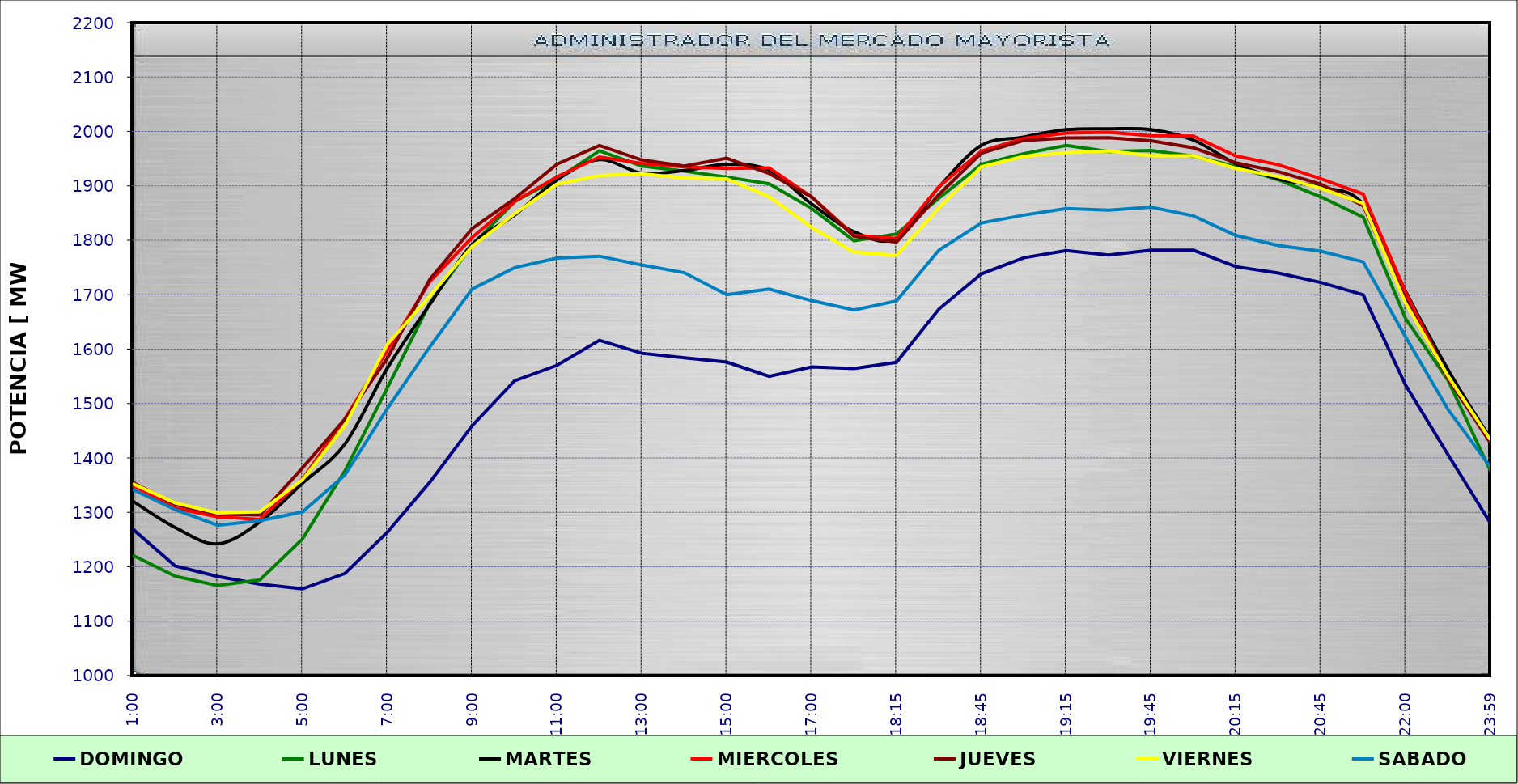
| Category | DOMINGO | LUNES | MARTES | MIERCOLES | JUEVES | VIERNES | SABADO |
|---|---|---|---|---|---|---|---|
| 0.041666666666666664 | 1269.32 | 1221.15 | 1320.69 | 1349.3 | 1354.98 | 1352.63 | 1342.05 |
| 0.0833333333333333 | 1201.42 | 1182.73 | 1272.12 | 1307.76 | 1314.38 | 1317.47 | 1304.84 |
| 0.125 | 1182.18 | 1165.47 | 1242.08 | 1291.84 | 1296.75 | 1298.78 | 1276.22 |
| 0.166666666666667 | 1167.98 | 1176 | 1282.62 | 1286.93 | 1295.22 | 1301.22 | 1284.7 |
| 0.208333333333333 | 1159.47 | 1251.11 | 1353.43 | 1361.15 | 1381.51 | 1359.65 | 1300.68 |
| 0.25 | 1187.6 | 1376.09 | 1425.53 | 1472.02 | 1471.34 | 1459.37 | 1368.42 |
| 0.291666666666667 | 1263.23 | 1528.44 | 1564.84 | 1597.07 | 1582.9 | 1608.51 | 1490.37 |
| 0.333333333333333 | 1355.18 | 1684.25 | 1681.92 | 1723.81 | 1728.24 | 1697.27 | 1603.75 |
| 0.375 | 1459.23 | 1791.16 | 1792.45 | 1805.2 | 1821.47 | 1788.9 | 1710.58 |
| 0.416666666666667 | 1541.74 | 1870.95 | 1846.07 | 1871.19 | 1876.46 | 1848.41 | 1749.61 |
| 0.458333333333333 | 1570.24 | 1912.86 | 1911.14 | 1916.82 | 1939.78 | 1903.26 | 1767.37 |
| 0.5 | 1616.25 | 1964.4 | 1948.23 | 1953.12 | 1974.18 | 1919.02 | 1770.78 |
| 0.541666666666667 | 1592.38 | 1936.37 | 1923.22 | 1941.32 | 1947.54 | 1922.29 | 1754.51 |
| 0.583333333333333 | 1584.15 | 1927.25 | 1928.24 | 1935.06 | 1936.43 | 1914.34 | 1740.46 |
| 0.625 | 1576.19 | 1916.18 | 1939.3 | 1932.13 | 1950.7 | 1913.01 | 1699.99 |
| 0.666666666666667 | 1550.01 | 1903.7 | 1928.78 | 1933.22 | 1922.72 | 1879.8 | 1710.28 |
| 0.708333333333333 | 1567.39 | 1858.54 | 1866.91 | 1879.93 | 1879.72 | 1823.8 | 1689.12 |
| 0.75 | 1564.39 | 1798.99 | 1815.7 | 1809.32 | 1807.13 | 1777.98 | 1671.9 |
| 0.7604166666666666 | 1575.74 | 1811.64 | 1803.54 | 1803.41 | 1796.32 | 1772.38 | 1688.61 |
| 0.7708333333333334 | 1673.51 | 1877.26 | 1897.59 | 1898.59 | 1884.03 | 1859.83 | 1781.81 |
| 0.78125 | 1738.28 | 1939.55 | 1974.27 | 1964 | 1959.98 | 1935.11 | 1831.88 |
| 0.7916666666666666 | 1767.82 | 1959.28 | 1989.82 | 1987.37 | 1983.42 | 1954.14 | 1846.32 |
| 0.8020833333333334 | 1781 | 1974.48 | 2003.22 | 1996.98 | 1987.96 | 1960.98 | 1858.23 |
| 0.8125 | 1772.95 | 1963.23 | 2004.78 | 1998.34 | 1988.56 | 1964.38 | 1855.25 |
| 0.8229166666666666 | 1781.71 | 1965.18 | 2003.45 | 1992.11 | 1983 | 1955.28 | 1860.95 |
| 0.8333333333333334 | 1781.6 | 1954.59 | 1984.01 | 1991.31 | 1969.81 | 1955.33 | 1844.79 |
| 0.84375 | 1751.41 | 1935.72 | 1940.84 | 1955.02 | 1942.57 | 1932.04 | 1808.91 |
| 0.8541666666666666 | 1739.81 | 1911.15 | 1912.97 | 1938.94 | 1926.09 | 1916.98 | 1790.36 |
| 0.8645833333333334 | 1722.52 | 1879.84 | 1897.36 | 1913.29 | 1903.35 | 1895.51 | 1779.88 |
| 0.875 | 1699.7 | 1842.55 | 1865.82 | 1884.92 | 1863.8 | 1867.7 | 1760.33 |
| 0.9166666666666666 | 1533.72 | 1655.98 | 1706.24 | 1704 | 1691.22 | 1684.44 | 1622.16 |
| 0.9583333333333334 | 1405.94 | 1542.45 | 1562.2 | 1545.84 | 1545.69 | 1550.31 | 1489.01 |
| 0.9993055555555556 | 1279.98 | 1376.24 | 1435.39 | 1429.48 | 1427.25 | 1433.26 | 1383.07 |